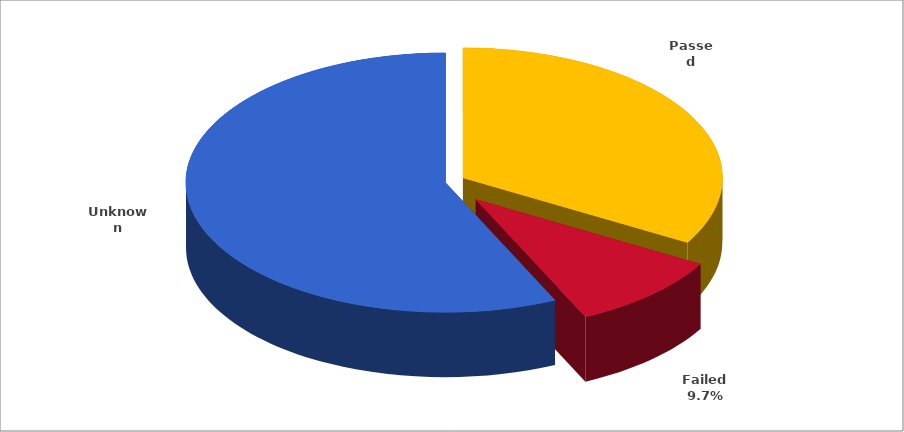
| Category | Series 0 |
|---|---|
| 0 | 0.333 |
| 1 | 0.097 |
| 2 | 0.569 |